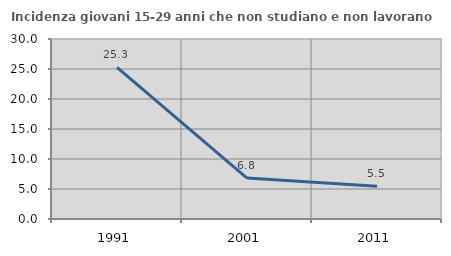
| Category | Incidenza giovani 15-29 anni che non studiano e non lavorano  |
|---|---|
| 1991.0 | 25.275 |
| 2001.0 | 6.826 |
| 2011.0 | 5.455 |